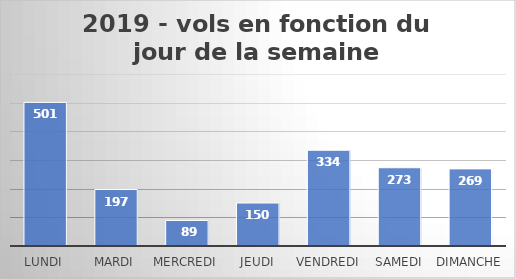
| Category | Nombre de vols |
|---|---|
| Lundi | 501 |
| Mardi | 197 |
| Mercredi | 89 |
| Jeudi | 150 |
| Vendredi | 334 |
| Samedi | 273 |
| Dimanche | 269 |